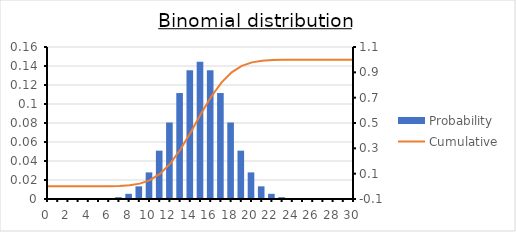
| Category | Probability |
|---|---|
| 0.0 | 0 |
| 1.0 | 0 |
| 2.0 | 0 |
| 3.0 | 0 |
| 4.0 | 0 |
| 5.0 | 0 |
| 6.0 | 0.001 |
| 7.0 | 0.002 |
| 8.0 | 0.005 |
| 9.0 | 0.013 |
| 10.0 | 0.028 |
| 11.0 | 0.051 |
| 12.0 | 0.081 |
| 13.0 | 0.112 |
| 14.0 | 0.135 |
| 15.0 | 0.144 |
| 16.0 | 0.135 |
| 17.0 | 0.112 |
| 18.0 | 0.081 |
| 19.0 | 0.051 |
| 20.0 | 0.028 |
| 21.0 | 0.013 |
| 22.0 | 0.005 |
| 23.0 | 0.002 |
| 24.0 | 0.001 |
| 25.0 | 0 |
| 26.0 | 0 |
| 27.0 | 0 |
| 28.0 | 0 |
| 29.0 | 0 |
| 30.0 | 0 |